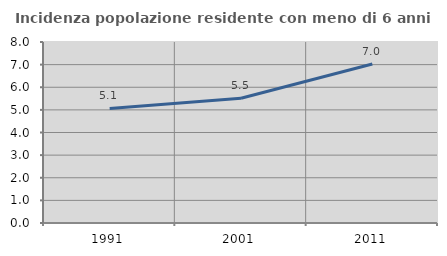
| Category | Incidenza popolazione residente con meno di 6 anni |
|---|---|
| 1991.0 | 5.066 |
| 2001.0 | 5.515 |
| 2011.0 | 7.027 |